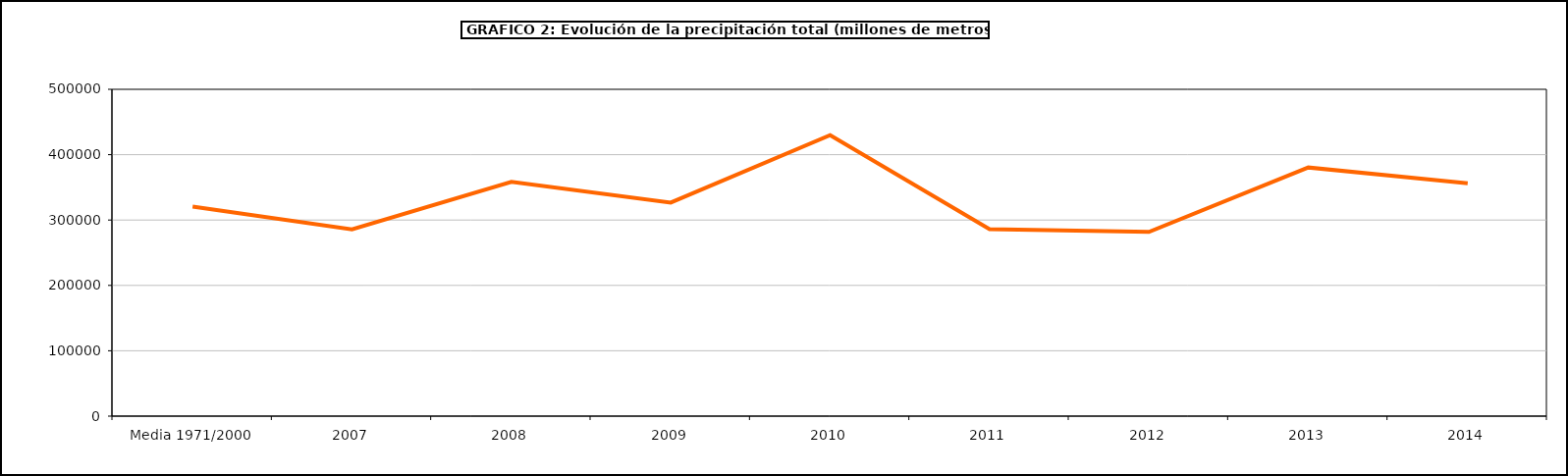
| Category | Series 0 |
|---|---|
| 0 | 320442 |
| 1 | 285630.26 |
| 2 | 358273.25 |
| 3 | 326778 |
| 4 | 429768 |
| 5 | 285948 |
| 6 | 281817 |
| 7 | 380420 |
| 8 | 356097 |